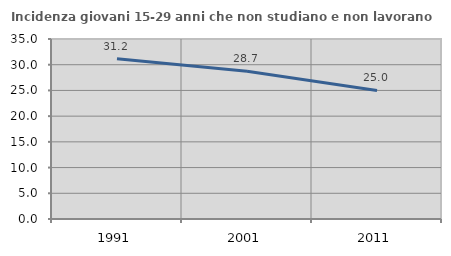
| Category | Incidenza giovani 15-29 anni che non studiano e non lavorano  |
|---|---|
| 1991.0 | 31.169 |
| 2001.0 | 28.733 |
| 2011.0 | 25 |